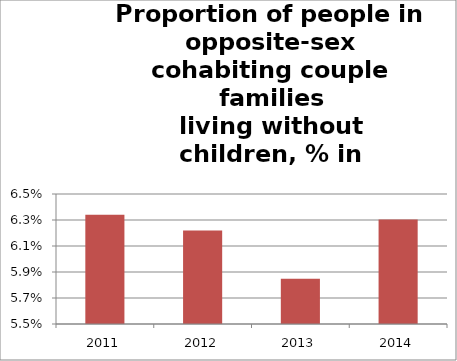
| Category | Series 1 |
|---|---|
| 2011.0 | 0.063 |
| 2012.0 | 0.062 |
| 2013.0 | 0.058 |
| 2014.0 | 0.063 |